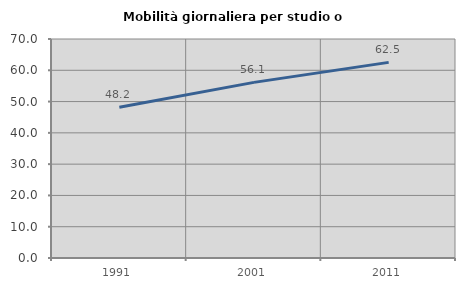
| Category | Mobilità giornaliera per studio o lavoro |
|---|---|
| 1991.0 | 48.176 |
| 2001.0 | 56.131 |
| 2011.0 | 62.527 |